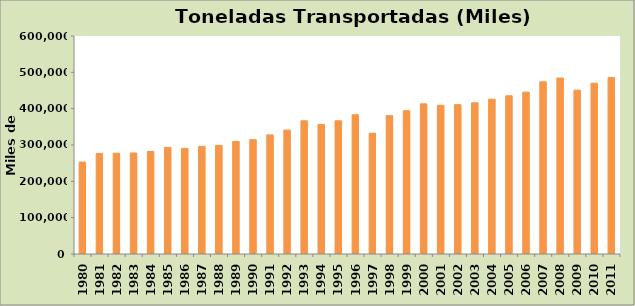
| Category | Carga general |
|---|---|
| 1980.0 | 253169 |
| 1981.0 | 276292 |
| 1982.0 | 277353 |
| 1983.0 | 278082 |
| 1984.0 | 282183 |
| 1985.0 | 293409 |
| 1986.0 | 290559 |
| 1987.0 | 296088 |
| 1988.0 | 298870 |
| 1989.0 | 309803 |
| 1990.0 | 314675 |
| 1991.0 | 327773 |
| 1992.0 | 341060 |
| 1993.0 | 366628 |
| 1994.0 | 356487 |
| 1995.0 | 366673 |
| 1996.0 | 383267 |
| 1997.0 | 332466 |
| 1998.0 | 380801 |
| 1999.0 | 394432 |
| 2000.0 | 413193 |
| 2001.0 | 409210 |
| 2002.0 | 411100 |
| 2003.0 | 416200 |
| 2004.0 | 426100 |
| 2005.0 | 435500 |
| 2006.0 | 445449 |
| 2007.0 | 473859.862 |
| 2008.0 | 484300 |
| 2009.0 | 450900 |
| 2010.0 | 470000 |
| 2011.0 | 485502 |